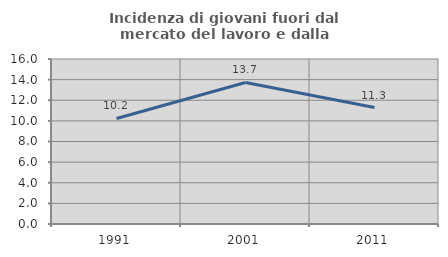
| Category | Incidenza di giovani fuori dal mercato del lavoro e dalla formazione  |
|---|---|
| 1991.0 | 10.236 |
| 2001.0 | 13.725 |
| 2011.0 | 11.29 |